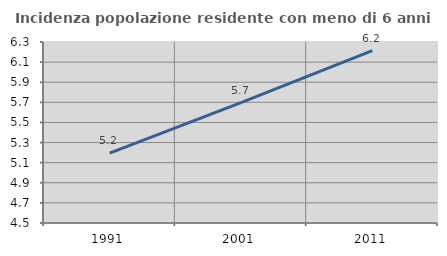
| Category | Incidenza popolazione residente con meno di 6 anni |
|---|---|
| 1991.0 | 5.195 |
| 2001.0 | 5.697 |
| 2011.0 | 6.214 |